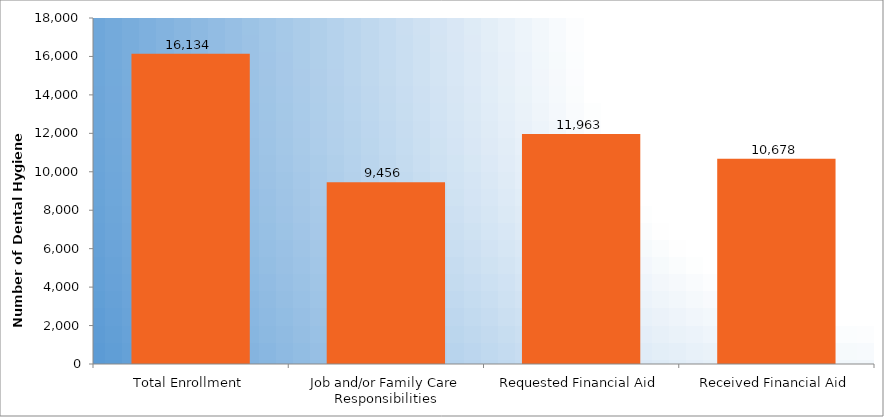
| Category | Number of Dental Hygiene Students |
|---|---|
| Total Enrollment | 16134 |
| Job and/or Family Care Responsibilities | 9456 |
| Requested Financial Aid | 11963 |
| Received Financial Aid | 10678 |